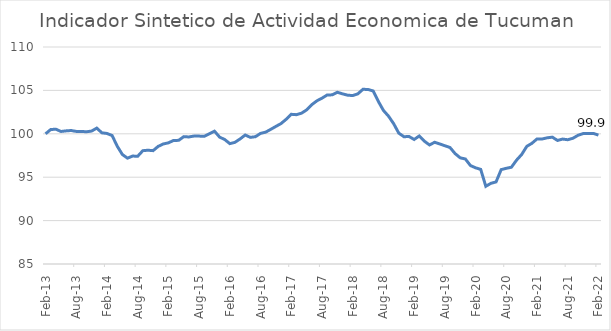
| Category | ISAET |
|---|---|
| 2013-02-01 | 100 |
| 2013-03-01 | 100.487 |
| 2013-04-01 | 100.534 |
| 2013-05-01 | 100.268 |
| 2013-06-01 | 100.336 |
| 2013-07-01 | 100.38 |
| 2013-08-01 | 100.274 |
| 2013-09-01 | 100.269 |
| 2013-10-01 | 100.235 |
| 2013-11-01 | 100.316 |
| 2013-12-01 | 100.656 |
| 2014-01-01 | 100.113 |
| 2014-02-01 | 100.039 |
| 2014-03-01 | 99.802 |
| 2014-04-01 | 98.572 |
| 2014-05-01 | 97.618 |
| 2014-06-01 | 97.193 |
| 2014-07-01 | 97.434 |
| 2014-08-01 | 97.414 |
| 2014-09-01 | 98.055 |
| 2014-10-01 | 98.107 |
| 2014-11-01 | 98.058 |
| 2014-12-01 | 98.55 |
| 2015-01-01 | 98.829 |
| 2015-02-01 | 98.959 |
| 2015-03-01 | 99.234 |
| 2015-04-01 | 99.245 |
| 2015-05-01 | 99.673 |
| 2015-06-01 | 99.636 |
| 2015-07-01 | 99.742 |
| 2015-08-01 | 99.736 |
| 2015-09-01 | 99.706 |
| 2015-10-01 | 100.002 |
| 2015-11-01 | 100.3 |
| 2015-12-01 | 99.619 |
| 2016-01-01 | 99.339 |
| 2016-02-01 | 98.866 |
| 2016-03-01 | 99.017 |
| 2016-04-01 | 99.408 |
| 2016-05-01 | 99.86 |
| 2016-06-01 | 99.589 |
| 2016-07-01 | 99.668 |
| 2016-08-01 | 100.049 |
| 2016-09-01 | 100.192 |
| 2016-10-01 | 100.517 |
| 2016-11-01 | 100.855 |
| 2016-12-01 | 101.179 |
| 2017-01-01 | 101.672 |
| 2017-02-01 | 102.247 |
| 2017-03-01 | 102.203 |
| 2017-04-01 | 102.376 |
| 2017-05-01 | 102.753 |
| 2017-06-01 | 103.356 |
| 2017-07-01 | 103.798 |
| 2017-08-01 | 104.105 |
| 2017-09-01 | 104.468 |
| 2017-10-01 | 104.489 |
| 2017-11-01 | 104.784 |
| 2017-12-01 | 104.605 |
| 2018-01-01 | 104.45 |
| 2018-02-01 | 104.405 |
| 2018-03-01 | 104.601 |
| 2018-04-01 | 105.125 |
| 2018-05-01 | 105.109 |
| 2018-06-01 | 104.932 |
| 2018-07-01 | 103.74 |
| 2018-08-01 | 102.692 |
| 2018-09-01 | 102.028 |
| 2018-10-01 | 101.162 |
| 2018-11-01 | 100.075 |
| 2018-12-01 | 99.665 |
| 2019-01-01 | 99.689 |
| 2019-02-01 | 99.346 |
| 2019-03-01 | 99.753 |
| 2019-04-01 | 99.149 |
| 2019-05-01 | 98.714 |
| 2019-06-01 | 99.023 |
| 2019-07-01 | 98.833 |
| 2019-08-01 | 98.623 |
| 2019-09-01 | 98.421 |
| 2019-10-01 | 97.721 |
| 2019-11-01 | 97.231 |
| 2019-12-01 | 97.099 |
| 2020-01-01 | 96.341 |
| 2020-02-01 | 96.083 |
| 2020-03-01 | 95.901 |
| 2020-04-01 | 93.952 |
| 2020-05-01 | 94.295 |
| 2020-06-01 | 94.458 |
| 2020-07-01 | 95.874 |
| 2020-08-01 | 96.024 |
| 2020-09-01 | 96.15 |
| 2020-10-01 | 96.963 |
| 2020-11-01 | 97.612 |
| 2020-12-01 | 98.551 |
| 2021-01-01 | 98.903 |
| 2021-02-01 | 99.41 |
| 2021-03-01 | 99.402 |
| 2021-04-01 | 99.54 |
| 2021-05-01 | 99.613 |
| 2021-06-01 | 99.232 |
| 2021-07-01 | 99.394 |
| 2021-08-01 | 99.316 |
| 2021-09-01 | 99.482 |
| 2021-10-01 | 99.823 |
| 2021-11-01 | 100.024 |
| 2021-12-01 | 100.03 |
| 2022-01-01 | 100.048 |
| 2022-02-01 | 99.85 |